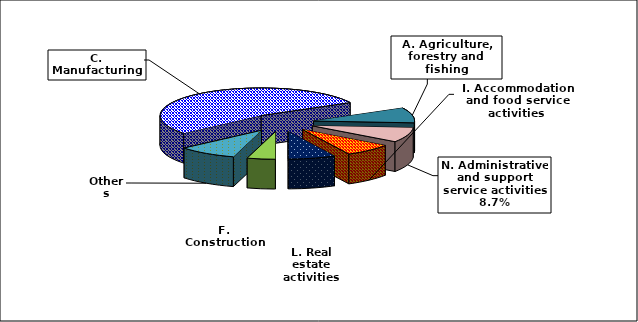
| Category | Series 0 |
|---|---|
| C. Manufacturing | 0.533 |
| A. Agriculture, forestry and fishing | 0.089 |
| N. Administrative and support service activities | 0.087 |
| I. Accommodation and food service activities | 0.077 |
| L. Real estate activities | 0.076 |
| F. Construction | 0.045 |
| Others | 0.094 |